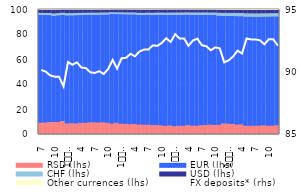
| Category | RSD (lhs) | EUR (lhs) | CHF (lhs) | USD (lhs) | Other currences (lhs) |
|---|---|---|---|---|---|
| 7 | 9.876 | 85.43 | 1.603 | 2.628 | 0.463 |
| 8 | 10.008 | 85.208 | 1.603 | 2.689 | 0.492 |
| 9 | 10.311 | 84.86 | 1.629 | 2.711 | 0.49 |
| 10 | 10.413 | 84.165 | 1.881 | 3.045 | 0.496 |
| 11 | 10.425 | 84.569 | 1.734 | 2.83 | 0.442 |
| 12 | 11.188 | 84.042 | 1.769 | 2.605 | 0.395 |
| 1
2009 | 9.24 | 85.724 | 1.782 | 2.831 | 0.422 |
| 2 | 9.458 | 85.524 | 1.763 | 2.823 | 0.432 |
| 3 | 9.27 | 85.828 | 1.738 | 2.741 | 0.424 |
| 4 | 9.682 | 85.469 | 1.725 | 2.699 | 0.425 |
| 5 | 9.724 | 85.569 | 1.708 | 2.566 | 0.432 |
| 6 | 10.068 | 85.36 | 1.648 | 2.492 | 0.433 |
| 7 | 10.115 | 85.37 | 1.61 | 2.46 | 0.446 |
| 8 | 9.977 | 85.528 | 1.604 | 2.438 | 0.452 |
| 9 | 10.198 | 85.428 | 1.58 | 2.357 | 0.438 |
| 10 | 9.798 | 85.869 | 1.566 | 2.324 | 0.444 |
| 11 | 9.072 | 86.943 | 1.452 | 2.142 | 0.39 |
| 12 | 9.77 | 86.189 | 1.43 | 2.229 | 0.383 |
| 1
2010 | 8.941 | 86.931 | 1.457 | 2.281 | 0.39 |
| 2 | 8.905 | 86.91 | 1.452 | 2.33 | 0.403 |
| 3 | 8.589 | 87.15 | 1.483 | 2.366 | 0.411 |
| 4 | 8.784 | 86.968 | 1.463 | 2.371 | 0.414 |
| 5 | 8.405 | 87.039 | 1.52 | 2.59 | 0.446 |
| 6 | 8.248 | 87.014 | 1.656 | 2.62 | 0.461 |
| 7 | 8.245 | 87.215 | 1.621 | 2.457 | 0.462 |
| 8 | 7.91 | 87.348 | 1.714 | 2.563 | 0.466 |
| 9 | 7.952 | 87.502 | 1.686 | 2.414 | 0.446 |
| 10 | 7.717 | 87.785 | 1.648 | 2.397 | 0.452 |
| 11 | 7.341 | 88.037 | 1.71 | 2.479 | 0.433 |
| 12 | 7.637 | 87.676 | 1.823 | 2.425 | 0.439 |
| 1
2011 | 7.016 | 88.347 | 1.817 | 2.386 | 0.434 |
| 2 | 7.37 | 87.996 | 1.823 | 2.371 | 0.44 |
| 3 | 7.354 | 88.074 | 1.805 | 2.324 | 0.443 |
| 4 | 7.945 | 87.579 | 1.807 | 2.221 | 0.447 |
| 5 | 7.515 | 87.803 | 1.911 | 2.315 | 0.454 |
| 6 | 7.377 | 87.927 | 1.938 | 2.308 | 0.45 |
| 7 | 7.904 | 87.283 | 2.056 | 2.295 | 0.462 |
| 8 | 7.98 | 87.307 | 1.991 | 2.247 | 0.475 |
| 9 | 8.301 | 86.921 | 1.94 | 2.369 | 0.469 |
| 10 | 8.073 | 87.169 | 1.977 | 2.309 | 0.473 |
| 11 | 8.146 | 86.605 | 2.259 | 2.48 | 0.509 |
| 12 | 9.27 | 85.174 | 2.419 | 2.595 | 0.541 |
| 1
2012 | 9.109 | 85.301 | 2.458 | 2.583 | 0.55 |
| 2 | 8.794 | 85.59 | 2.493 | 2.564 | 0.558 |
| 3 | 8.333 | 85.981 | 2.527 | 2.594 | 0.565 |
| 4 | 8.562 | 85.696 | 2.544 | 2.621 | 0.575 |
| 5 | 7.362 | 86.627 | 2.577 | 2.844 | 0.59 |
| 6 | 7.433 | 86.525 | 2.599 | 2.848 | 0.595 |
| 7 | 7.433 | 86.42 | 2.609 | 2.917 | 0.62 |
| 8 | 7.505 | 86.376 | 2.615 | 2.885 | 0.62 |
| 9 | 7.823 | 86.159 | 2.592 | 2.797 | 0.629 |
| 10 | 7.416 | 86.573 | 2.606 | 2.792 | 0.612 |
| 11 | 7.427 | 86.67 | 2.57 | 2.735 | 0.598 |
| 12 | 7.927 | 86.21 | 2.556 | 2.701 | 0.606 |